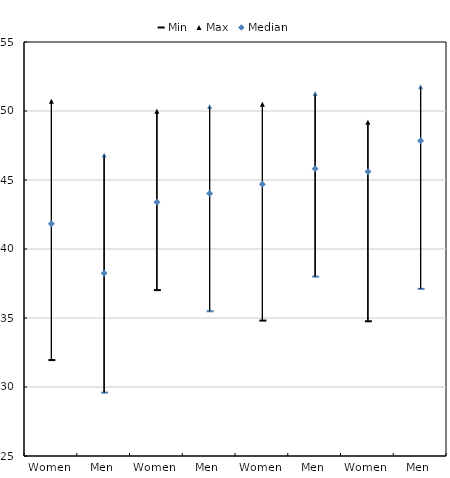
| Category | Min | Max | Median |
|---|---|---|---|
| Women | 31.951 | 50.703 | 41.837 |
| Men | 29.593 | 46.811 | 38.25 |
| Women | 37.021 | 49.973 | 43.397 |
| Men | 35.487 | 50.317 | 44.025 |
| Women | 34.812 | 50.489 | 44.696 |
| Men | 37.996 | 51.26 | 45.811 |
| Women | 34.761 | 49.18 | 45.607 |
| Men | 37.112 | 51.751 | 47.846 |